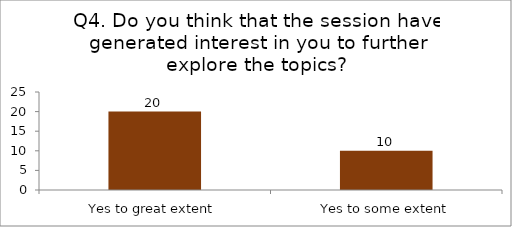
| Category | Q4. Do you think that the session have generated interest in you to further explore the topics? |
|---|---|
| Yes to great extent | 20 |
| Yes to some extent | 10 |